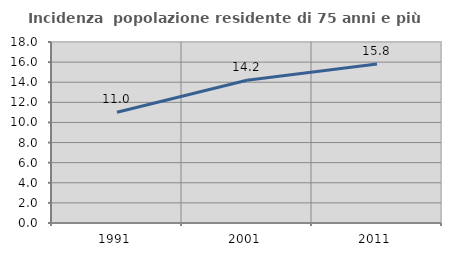
| Category | Incidenza  popolazione residente di 75 anni e più |
|---|---|
| 1991.0 | 11.019 |
| 2001.0 | 14.198 |
| 2011.0 | 15.802 |